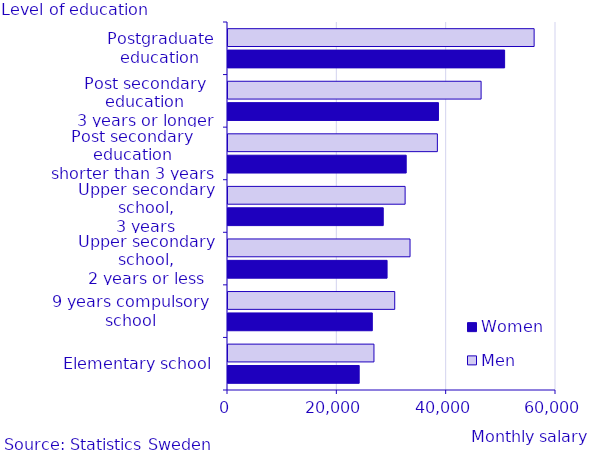
| Category | Women | Men |
|---|---|---|
| Elementary school | 24000 | 26700 |
| 9 years compulsory
school | 26400 | 30500 |
| Upper secondary school,
2 years or less | 29100 | 33300 |
| Upper secondary school,
3 years | 28400 | 32400 |
| Post secondary education
shorter than 3 years | 32600 | 38300 |
| Post secondary education
3 years or longer | 38500 | 46300 |
| Postgraduate education | 50600 | 56000 |